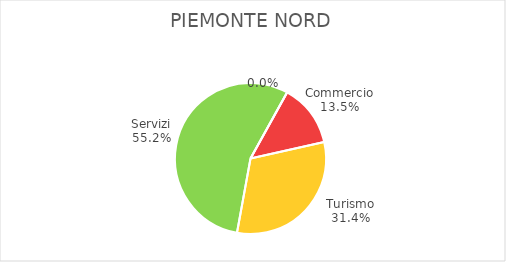
| Category | Piemonte Nord |
|---|---|
| Commercio | 5974 |
| Turismo | 13925 |
| Servizi | 24509 |